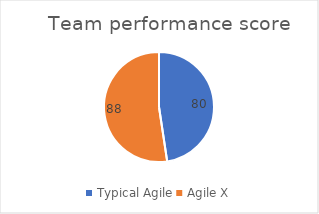
| Category | Team performance score |
|---|---|
| Typical Agile | 80 |
| Agile X | 88 |